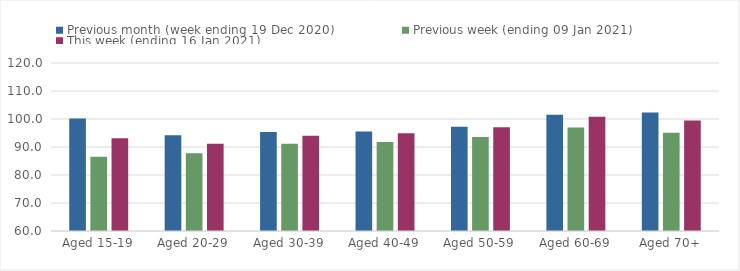
| Category | Previous month (week ending 19 Dec 2020) | Previous week (ending 09 Jan 2021) | This week (ending 16 Jan 2021) |
|---|---|---|---|
| Aged 15-19 | 100.17 | 86.56 | 93.12 |
| Aged 20-29 | 94.16 | 87.76 | 91.16 |
| Aged 30-39 | 95.33 | 91.18 | 94 |
| Aged 40-49 | 95.5 | 91.81 | 94.94 |
| Aged 50-59 | 97.22 | 93.61 | 97.07 |
| Aged 60-69 | 101.48 | 96.95 | 100.78 |
| Aged 70+ | 102.34 | 95.06 | 99.45 |